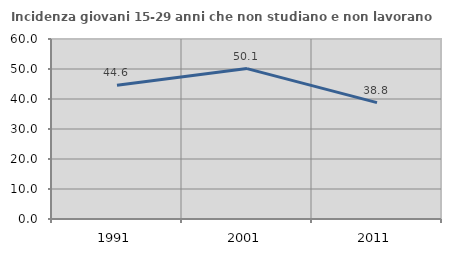
| Category | Incidenza giovani 15-29 anni che non studiano e non lavorano  |
|---|---|
| 1991.0 | 44.586 |
| 2001.0 | 50.135 |
| 2011.0 | 38.789 |